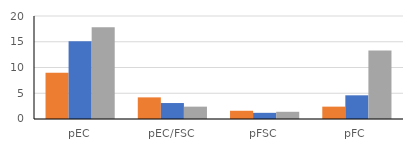
| Category | -5d-Multicolor assuming 30% double clones | -5d-MARCM assuming 70% double clones | -3.5d-MARCM assuming all double clones |
|---|---|---|---|
| pEC | 9 | 15.1 | 17.8 |
| pEC/FSC | 4.2 | 3.1 | 2.4 |
| pFSC | 1.6 | 1.2 | 1.4 |
| pFC | 2.4 | 4.6 | 13.3 |